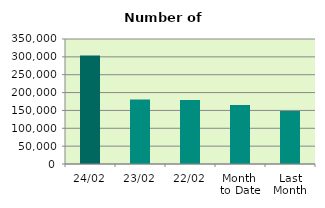
| Category | Series 0 |
|---|---|
| 24/02 | 303584 |
| 23/02 | 180566 |
| 22/02 | 179248 |
| Month 
to Date | 165470 |
| Last
Month | 148479.905 |